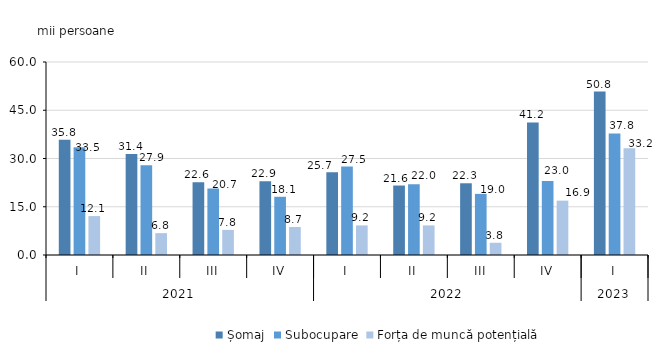
| Category | Șomaj | Subocupare | Forța de muncă potențială |
|---|---|---|---|
| 0 | 35.8 | 33.5 | 12.1 |
| 1 | 31.4 | 27.9 | 6.8 |
| 2 | 22.6 | 20.7 | 7.8 |
| 3 | 22.9 | 18.1 | 8.7 |
| 4 | 25.7 | 27.5 | 9.2 |
| 5 | 21.6 | 22 | 9.2 |
| 6 | 22.3 | 19 | 3.8 |
| 7 | 41.2 | 23 | 16.9 |
| 8 | 50.8 | 37.8 | 33.2 |